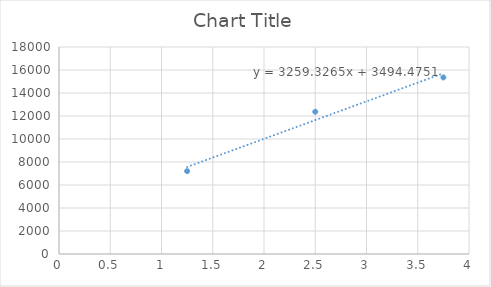
| Category | Series 0 |
|---|---|
| 1.25 | 7205.414 |
| 2.5 | 12369.229 |
| 3.75 | 15353.731 |